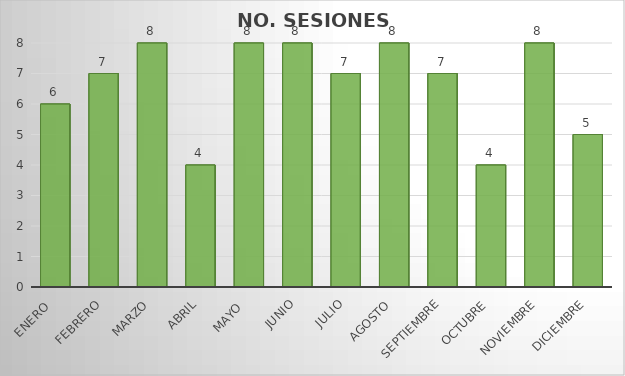
| Category | NO. SESIONES EFECTUADAS |
|---|---|
| Enero  | 6 |
| Febrero | 7 |
| Marzo | 8 |
| Abril | 4 |
| Mayo  | 8 |
| Junio | 8 |
| Julio | 7 |
| Agosto | 8 |
| Septiembre | 7 |
| Octubre | 4 |
| Noviembre | 8 |
| Diciembre | 5 |